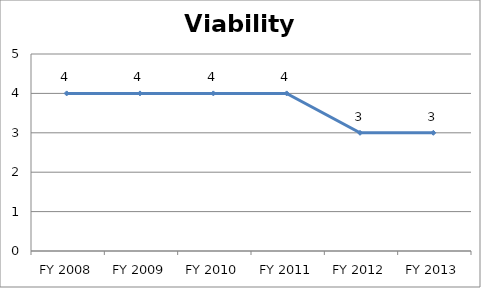
| Category | Viability score |
|---|---|
| FY 2013 | 3 |
| FY 2012 | 3 |
| FY 2011 | 4 |
| FY 2010 | 4 |
| FY 2009 | 4 |
| FY 2008 | 4 |